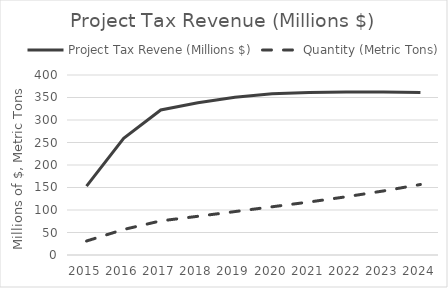
| Category | Project Tax Revene (Millions $) | Quantity (Metric Tons) |
|---|---|---|
| 2015.0 | 153 | 31.095 |
| 2016.0 | 259.517 | 56.685 |
| 2017.0 | 322.298 | 75.842 |
| 2018.0 | 338.4 | 86.015 |
| 2019.0 | 350.485 | 96.503 |
| 2020.0 | 358.079 | 107.139 |
| 2021.0 | 360.863 | 117.741 |
| 2022.0 | 362.308 | 129.409 |
| 2023.0 | 362.374 | 142.313 |
| 2024.0 | 361.011 | 156.66 |